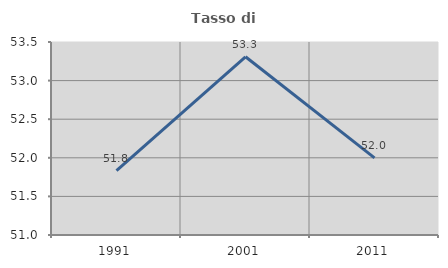
| Category | Tasso di occupazione   |
|---|---|
| 1991.0 | 51.833 |
| 2001.0 | 53.309 |
| 2011.0 | 51.999 |